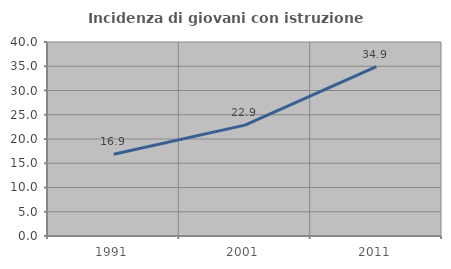
| Category | Incidenza di giovani con istruzione universitaria |
|---|---|
| 1991.0 | 16.854 |
| 2001.0 | 22.857 |
| 2011.0 | 34.94 |